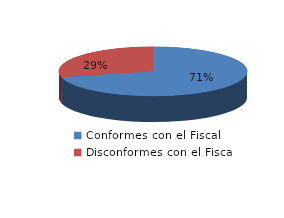
| Category | Series 0 |
|---|---|
| 0 | 69 |
| 1 | 28 |